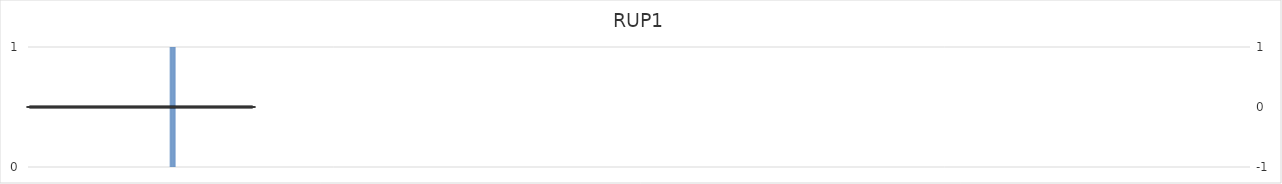
| Category | RUP1 |
|---|---|
| 1.0 | 0 |
| 2.0 | 0 |
| 3.0 | 0 |
| 4.0 | 0 |
| 5.0 | 0 |
| 6.0 | 0 |
| 7.0 | 0 |
| 8.0 | 0 |
| 9.0 | 0 |
| 10.0 | 0 |
| 11.0 | 0 |
| 12.0 | 0 |
| 13.0 | 0 |
| 14.0 | 0 |
| 15.0 | 0 |
| 16.0 | 0 |
| 17.0 | 0 |
| 18.0 | 0 |
| 19.0 | 0 |
| 20.0 | 0 |
| 21.0 | 0 |
| 22.0 | 0 |
| 23.0 | 0 |
| 24.0 | 0 |
| 25.0 | 0 |
| 26.0 | 0 |
| 27.0 | 0 |
| 28.0 | 0 |
| 29.0 | 0 |
| 30.0 | 0 |
| 31.0 | 0 |
| 32.0 | 0 |
| 33.0 | 0 |
| 34.0 | 0 |
| 35.0 | 0 |
| 36.0 | 0 |
| 37.0 | 0 |
| 38.0 | 0 |
| 39.0 | 0 |
| 40.0 | 0 |
| 41.0 | 0 |
| 42.0 | 0 |
| 43.0 | 0 |
| 44.0 | 0 |
| 45.0 | 0 |
| 46.0 | 0 |
| 47.0 | 0 |
| 48.0 | 0 |
| 49.0 | 0 |
| 50.0 | 0 |
| 51.0 | 0 |
| 52.0 | 0 |
| 53.0 | 0 |
| 54.0 | 0 |
| 55.0 | 0 |
| 56.0 | 0 |
| 57.0 | 0 |
| 58.0 | 0 |
| 59.0 | 0 |
| 60.0 | 0 |
| 61.0 | 0 |
| 62.0 | 0 |
| 63.0 | 0 |
| 64.0 | 0 |
| 65.0 | 0 |
| 66.0 | 0 |
| 67.0 | 0 |
| 68.0 | 0 |
| 69.0 | 0 |
| 70.0 | 0 |
| 71.0 | 0 |
| 72.0 | 0 |
| 73.0 | 0 |
| 74.0 | 0 |
| 75.0 | 0 |
| 76.0 | 0 |
| 77.0 | 0 |
| 78.0 | 0 |
| 79.0 | 0 |
| 80.0 | 0 |
| 81.0 | 0 |
| 82.0 | 0 |
| 83.0 | 0 |
| 84.0 | 0 |
| 85.0 | 0 |
| 86.0 | 0 |
| 87.0 | 0 |
| 88.0 | 0 |
| 89.0 | 0 |
| 90.0 | 0 |
| 91.0 | 0 |
| 92.0 | 0 |
| 93.0 | 0 |
| 94.0 | 0 |
| 95.0 | 0 |
| 96.0 | 0 |
| 97.0 | 0 |
| 98.0 | 0 |
| 99.0 | 0 |
| 100.0 | 0 |
| 101.0 | 0 |
| 102.0 | 0 |
| 103.0 | 0 |
| 104.0 | 0 |
| 105.0 | 0 |
| 106.0 | 0 |
| 107.0 | 0 |
| 108.0 | 0 |
| 109.0 | 0 |
| 110.0 | 0 |
| 111.0 | 0 |
| 112.0 | 0 |
| 113.0 | 0 |
| 114.0 | 0 |
| 115.0 | 0 |
| 116.0 | 0 |
| 117.0 | 0 |
| 118.0 | 0 |
| 119.0 | 0 |
| 120.0 | 0 |
| 121.0 | 0 |
| 122.0 | 0 |
| 123.0 | 0 |
| 124.0 | 0 |
| 125.0 | 0 |
| 126.0 | 0 |
| 127.0 | 0 |
| 128.0 | 0 |
| 129.0 | 0 |
| 130.0 | 0 |
| 131.0 | 0 |
| 132.0 | 0 |
| 133.0 | 0 |
| 134.0 | 0 |
| 135.0 | 0 |
| 136.0 | 0 |
| 137.0 | 0 |
| 138.0 | 0 |
| 139.0 | 0 |
| 140.0 | 0 |
| 141.0 | 0 |
| 142.0 | 0 |
| 143.0 | 0 |
| 144.0 | 0 |
| 145.0 | 0 |
| 146.0 | 0 |
| 147.0 | 0 |
| 148.0 | 0 |
| 149.0 | 0 |
| 150.0 | 0 |
| 151.0 | 0 |
| 152.0 | 0 |
| 153.0 | 0 |
| 154.0 | 0 |
| 155.0 | 0 |
| 156.0 | 0 |
| 157.0 | 0 |
| 158.0 | 0 |
| 159.0 | 0 |
| 160.0 | 0 |
| 161.0 | 0 |
| 162.0 | 0 |
| 163.0 | 0 |
| 164.0 | 0 |
| 165.0 | 0 |
| 166.0 | 0 |
| 167.0 | 0 |
| 168.0 | 0 |
| 169.0 | 0 |
| 170.0 | 0 |
| 171.0 | 0 |
| 172.0 | 0 |
| 173.0 | 0 |
| 174.0 | 0 |
| 175.0 | 0 |
| 176.0 | 0 |
| 177.0 | 0 |
| 178.0 | 0 |
| 179.0 | 0 |
| 180.0 | 0 |
| 181.0 | 0 |
| 182.0 | 0 |
| 183.0 | 0 |
| 184.0 | 0 |
| 185.0 | 0 |
| 186.0 | 0 |
| 187.0 | 0 |
| 188.0 | 0 |
| 189.0 | 0 |
| 190.0 | 0 |
| 191.0 | 0 |
| 192.0 | 0 |
| 193.0 | 0 |
| 194.0 | 0 |
| 195.0 | 0 |
| 196.0 | 0 |
| 197.0 | 0 |
| 198.0 | 0 |
| 199.0 | 1 |
| 200.0 | 1 |
| 201.0 | 1 |
| 202.0 | 1 |
| 203.0 | 1 |
| 204.0 | 1 |
| 205.0 | 1 |
| 206.0 | 1 |
| 207.0 | 0 |
| 208.0 | 0 |
| 209.0 | 0 |
| 210.0 | 0 |
| 211.0 | 0 |
| 212.0 | 0 |
| 213.0 | 0 |
| 214.0 | 0 |
| 215.0 | 0 |
| 216.0 | 0 |
| 217.0 | 0 |
| 218.0 | 0 |
| 219.0 | 0 |
| 220.0 | 0 |
| 221.0 | 0 |
| 222.0 | 0 |
| 223.0 | 0 |
| 224.0 | 0 |
| 225.0 | 0 |
| 226.0 | 0 |
| 227.0 | 0 |
| 228.0 | 0 |
| 229.0 | 0 |
| 230.0 | 0 |
| 231.0 | 0 |
| 232.0 | 0 |
| 233.0 | 0 |
| 234.0 | 0 |
| 235.0 | 0 |
| 236.0 | 0 |
| 237.0 | 0 |
| 238.0 | 0 |
| 239.0 | 0 |
| 240.0 | 0 |
| 241.0 | 0 |
| 242.0 | 0 |
| 243.0 | 0 |
| 244.0 | 0 |
| 245.0 | 0 |
| 246.0 | 0 |
| 247.0 | 0 |
| 248.0 | 0 |
| 249.0 | 0 |
| 250.0 | 0 |
| 251.0 | 0 |
| 252.0 | 0 |
| 253.0 | 0 |
| 254.0 | 0 |
| 255.0 | 0 |
| 256.0 | 0 |
| 257.0 | 0 |
| 258.0 | 0 |
| 259.0 | 0 |
| 260.0 | 0 |
| 261.0 | 0 |
| 262.0 | 0 |
| 263.0 | 0 |
| 264.0 | 0 |
| 265.0 | 0 |
| 266.0 | 0 |
| 267.0 | 0 |
| 268.0 | 0 |
| 269.0 | 0 |
| 270.0 | 0 |
| 271.0 | 0 |
| 272.0 | 0 |
| 273.0 | 0 |
| 274.0 | 0 |
| 275.0 | 0 |
| 276.0 | 0 |
| 277.0 | 0 |
| 278.0 | 0 |
| 279.0 | 0 |
| 280.0 | 0 |
| 281.0 | 0 |
| 282.0 | 0 |
| 283.0 | 0 |
| 284.0 | 0 |
| 285.0 | 0 |
| 286.0 | 0 |
| 287.0 | 0 |
| 288.0 | 0 |
| 289.0 | 0 |
| 290.0 | 0 |
| 291.0 | 0 |
| 292.0 | 0 |
| 293.0 | 0 |
| 294.0 | 0 |
| 295.0 | 0 |
| 296.0 | 0 |
| 297.0 | 0 |
| 298.0 | 0 |
| 299.0 | 0 |
| 300.0 | 0 |
| 301.0 | 0 |
| 302.0 | 0 |
| 303.0 | 0 |
| 304.0 | 0 |
| 305.0 | 0 |
| 306.0 | 0 |
| 307.0 | 0 |
| 308.0 | 0 |
| 309.0 | 0 |
| 310.0 | 0 |
| 311.0 | 0 |
| 312.0 | 0 |
| 313.0 | 0 |
| 314.0 | 0 |
| 315.0 | 0 |
| 316.0 | 0 |
| 317.0 | 0 |
| 318.0 | 0 |
| 319.0 | 0 |
| 320.0 | 0 |
| 321.0 | 0 |
| 322.0 | 0 |
| 323.0 | 0 |
| 324.0 | 0 |
| 325.0 | 0 |
| 326.0 | 0 |
| 327.0 | 0 |
| 328.0 | 0 |
| 329.0 | 0 |
| 330.0 | 0 |
| 331.0 | 0 |
| 332.0 | 0 |
| 333.0 | 0 |
| 334.0 | 0 |
| 335.0 | 0 |
| 336.0 | 0 |
| 337.0 | 0 |
| 338.0 | 0 |
| 339.0 | 0 |
| 340.0 | 0 |
| 341.0 | 0 |
| 342.0 | 0 |
| 343.0 | 0 |
| 344.0 | 0 |
| 345.0 | 0 |
| 346.0 | 0 |
| 347.0 | 0 |
| 348.0 | 0 |
| 349.0 | 0 |
| 350.0 | 0 |
| 351.0 | 0 |
| 352.0 | 0 |
| 353.0 | 0 |
| 354.0 | 0 |
| 355.0 | 0 |
| 356.0 | 0 |
| 357.0 | 0 |
| 358.0 | 0 |
| 359.0 | 0 |
| 360.0 | 0 |
| 361.0 | 0 |
| 362.0 | 0 |
| 363.0 | 0 |
| 364.0 | 0 |
| 365.0 | 0 |
| 366.0 | 0 |
| 367.0 | 0 |
| 368.0 | 0 |
| 369.0 | 0 |
| 370.0 | 0 |
| 371.0 | 0 |
| 372.0 | 0 |
| 373.0 | 0 |
| 374.0 | 0 |
| 375.0 | 0 |
| 376.0 | 0 |
| 377.0 | 0 |
| 378.0 | 0 |
| 379.0 | 0 |
| 380.0 | 0 |
| 381.0 | 0 |
| 382.0 | 0 |
| 383.0 | 0 |
| 384.0 | 0 |
| 385.0 | 0 |
| 386.0 | 0 |
| 387.0 | 0 |
| 388.0 | 0 |
| 389.0 | 0 |
| 390.0 | 0 |
| 391.0 | 0 |
| 392.0 | 0 |
| 393.0 | 0 |
| 394.0 | 0 |
| 395.0 | 0 |
| 396.0 | 0 |
| 397.0 | 0 |
| 398.0 | 0 |
| 399.0 | 0 |
| 400.0 | 0 |
| 401.0 | 0 |
| 402.0 | 0 |
| 403.0 | 0 |
| 404.0 | 0 |
| 405.0 | 0 |
| 406.0 | 0 |
| 407.0 | 0 |
| 408.0 | 0 |
| 409.0 | 0 |
| 410.0 | 0 |
| 411.0 | 0 |
| 412.0 | 0 |
| 413.0 | 0 |
| 414.0 | 0 |
| 415.0 | 0 |
| 416.0 | 0 |
| 417.0 | 0 |
| 418.0 | 0 |
| 419.0 | 0 |
| 420.0 | 0 |
| 421.0 | 0 |
| 422.0 | 0 |
| 423.0 | 0 |
| 424.0 | 0 |
| 425.0 | 0 |
| 426.0 | 0 |
| 427.0 | 0 |
| 428.0 | 0 |
| 429.0 | 0 |
| 430.0 | 0 |
| 431.0 | 0 |
| 432.0 | 0 |
| 433.0 | 0 |
| 434.0 | 0 |
| 435.0 | 0 |
| 436.0 | 0 |
| 437.0 | 0 |
| 438.0 | 0 |
| 439.0 | 0 |
| 440.0 | 0 |
| 441.0 | 0 |
| 442.0 | 0 |
| 443.0 | 0 |
| 444.0 | 0 |
| 445.0 | 0 |
| 446.0 | 0 |
| 447.0 | 0 |
| 448.0 | 0 |
| 449.0 | 0 |
| 450.0 | 0 |
| 451.0 | 0 |
| 452.0 | 0 |
| 453.0 | 0 |
| 454.0 | 0 |
| 455.0 | 0 |
| 456.0 | 0 |
| 457.0 | 0 |
| 458.0 | 0 |
| 459.0 | 0 |
| 460.0 | 0 |
| 461.0 | 0 |
| 462.0 | 0 |
| 463.0 | 0 |
| 464.0 | 0 |
| 465.0 | 0 |
| 466.0 | 0 |
| 467.0 | 0 |
| 468.0 | 0 |
| 469.0 | 0 |
| 470.0 | 0 |
| 471.0 | 0 |
| 472.0 | 0 |
| 473.0 | 0 |
| 474.0 | 0 |
| 475.0 | 0 |
| 476.0 | 0 |
| 477.0 | 0 |
| 478.0 | 0 |
| 479.0 | 0 |
| 480.0 | 0 |
| 481.0 | 0 |
| 482.0 | 0 |
| 483.0 | 0 |
| 484.0 | 0 |
| 485.0 | 0 |
| 486.0 | 0 |
| 487.0 | 0 |
| 488.0 | 0 |
| 489.0 | 0 |
| 490.0 | 0 |
| 491.0 | 0 |
| 492.0 | 0 |
| 493.0 | 0 |
| 494.0 | 0 |
| 495.0 | 0 |
| 496.0 | 0 |
| 497.0 | 0 |
| 498.0 | 0 |
| 499.0 | 0 |
| 500.0 | 0 |
| 501.0 | 0 |
| 502.0 | 0 |
| 503.0 | 0 |
| 504.0 | 0 |
| 505.0 | 0 |
| 506.0 | 0 |
| 507.0 | 0 |
| 508.0 | 0 |
| 509.0 | 0 |
| 510.0 | 0 |
| 511.0 | 0 |
| 512.0 | 0 |
| 513.0 | 0 |
| 514.0 | 0 |
| 515.0 | 0 |
| 516.0 | 0 |
| 517.0 | 0 |
| 518.0 | 0 |
| 519.0 | 0 |
| 520.0 | 0 |
| 521.0 | 0 |
| 522.0 | 0 |
| 523.0 | 0 |
| 524.0 | 0 |
| 525.0 | 0 |
| 526.0 | 0 |
| 527.0 | 0 |
| 528.0 | 0 |
| 529.0 | 0 |
| 530.0 | 0 |
| 531.0 | 0 |
| 532.0 | 0 |
| 533.0 | 0 |
| 534.0 | 0 |
| 535.0 | 0 |
| 536.0 | 0 |
| 537.0 | 0 |
| 538.0 | 0 |
| 539.0 | 0 |
| 540.0 | 0 |
| 541.0 | 0 |
| 542.0 | 0 |
| 543.0 | 0 |
| 544.0 | 0 |
| 545.0 | 0 |
| 546.0 | 0 |
| 547.0 | 0 |
| 548.0 | 0 |
| 549.0 | 0 |
| 550.0 | 0 |
| 551.0 | 0 |
| 552.0 | 0 |
| 553.0 | 0 |
| 554.0 | 0 |
| 555.0 | 0 |
| 556.0 | 0 |
| 557.0 | 0 |
| 558.0 | 0 |
| 559.0 | 0 |
| 560.0 | 0 |
| 561.0 | 0 |
| 562.0 | 0 |
| 563.0 | 0 |
| 564.0 | 0 |
| 565.0 | 0 |
| 566.0 | 0 |
| 567.0 | 0 |
| 568.0 | 0 |
| 569.0 | 0 |
| 570.0 | 0 |
| 571.0 | 0 |
| 572.0 | 0 |
| 573.0 | 0 |
| 574.0 | 0 |
| 575.0 | 0 |
| 576.0 | 0 |
| 577.0 | 0 |
| 578.0 | 0 |
| 579.0 | 0 |
| 580.0 | 0 |
| 581.0 | 0 |
| 582.0 | 0 |
| 583.0 | 0 |
| 584.0 | 0 |
| 585.0 | 0 |
| 586.0 | 0 |
| 587.0 | 0 |
| 588.0 | 0 |
| 589.0 | 0 |
| 590.0 | 0 |
| 591.0 | 0 |
| 592.0 | 0 |
| 593.0 | 0 |
| 594.0 | 0 |
| 595.0 | 0 |
| 596.0 | 0 |
| 597.0 | 0 |
| 598.0 | 0 |
| 599.0 | 0 |
| 600.0 | 0 |
| 601.0 | 0 |
| 602.0 | 0 |
| 603.0 | 0 |
| 604.0 | 0 |
| 605.0 | 0 |
| 606.0 | 0 |
| 607.0 | 0 |
| 608.0 | 0 |
| 609.0 | 0 |
| 610.0 | 0 |
| 611.0 | 0 |
| 612.0 | 0 |
| 613.0 | 0 |
| 614.0 | 0 |
| 615.0 | 0 |
| 616.0 | 0 |
| 617.0 | 0 |
| 618.0 | 0 |
| 619.0 | 0 |
| 620.0 | 0 |
| 621.0 | 0 |
| 622.0 | 0 |
| 623.0 | 0 |
| 624.0 | 0 |
| 625.0 | 0 |
| 626.0 | 0 |
| 627.0 | 0 |
| 628.0 | 0 |
| 629.0 | 0 |
| 630.0 | 0 |
| 631.0 | 0 |
| 632.0 | 0 |
| 633.0 | 0 |
| 634.0 | 0 |
| 635.0 | 0 |
| 636.0 | 0 |
| 637.0 | 0 |
| 638.0 | 0 |
| 639.0 | 0 |
| 640.0 | 0 |
| 641.0 | 0 |
| 642.0 | 0 |
| 643.0 | 0 |
| 644.0 | 0 |
| 645.0 | 0 |
| 646.0 | 0 |
| 647.0 | 0 |
| 648.0 | 0 |
| 649.0 | 0 |
| 650.0 | 0 |
| 651.0 | 0 |
| 652.0 | 0 |
| 653.0 | 0 |
| 654.0 | 0 |
| 655.0 | 0 |
| 656.0 | 0 |
| 657.0 | 0 |
| 658.0 | 0 |
| 659.0 | 0 |
| 660.0 | 0 |
| 661.0 | 0 |
| 662.0 | 0 |
| 663.0 | 0 |
| 664.0 | 0 |
| 665.0 | 0 |
| 666.0 | 0 |
| 667.0 | 0 |
| 668.0 | 0 |
| 669.0 | 0 |
| 670.0 | 0 |
| 671.0 | 0 |
| 672.0 | 0 |
| 673.0 | 0 |
| 674.0 | 0 |
| 675.0 | 0 |
| 676.0 | 0 |
| 677.0 | 0 |
| 678.0 | 0 |
| 679.0 | 0 |
| 680.0 | 0 |
| 681.0 | 0 |
| 682.0 | 0 |
| 683.0 | 0 |
| 684.0 | 0 |
| 685.0 | 0 |
| 686.0 | 0 |
| 687.0 | 0 |
| 688.0 | 0 |
| 689.0 | 0 |
| 690.0 | 0 |
| 691.0 | 0 |
| 692.0 | 0 |
| 693.0 | 0 |
| 694.0 | 0 |
| 695.0 | 0 |
| 696.0 | 0 |
| 697.0 | 0 |
| 698.0 | 0 |
| 699.0 | 0 |
| 700.0 | 0 |
| 701.0 | 0 |
| 702.0 | 0 |
| 703.0 | 0 |
| 704.0 | 0 |
| 705.0 | 0 |
| 706.0 | 0 |
| 707.0 | 0 |
| 708.0 | 0 |
| 709.0 | 0 |
| 710.0 | 0 |
| 711.0 | 0 |
| 712.0 | 0 |
| 713.0 | 0 |
| 714.0 | 0 |
| 715.0 | 0 |
| 716.0 | 0 |
| 717.0 | 0 |
| 718.0 | 0 |
| 719.0 | 0 |
| 720.0 | 0 |
| 721.0 | 0 |
| 722.0 | 0 |
| 723.0 | 0 |
| 724.0 | 0 |
| 725.0 | 0 |
| 726.0 | 0 |
| 727.0 | 0 |
| 728.0 | 0 |
| 729.0 | 0 |
| 730.0 | 0 |
| 731.0 | 0 |
| 732.0 | 0 |
| 733.0 | 0 |
| 734.0 | 0 |
| 735.0 | 0 |
| 736.0 | 0 |
| 737.0 | 0 |
| 738.0 | 0 |
| 739.0 | 0 |
| 740.0 | 0 |
| 741.0 | 0 |
| 742.0 | 0 |
| 743.0 | 0 |
| 744.0 | 0 |
| 745.0 | 0 |
| 746.0 | 0 |
| 747.0 | 0 |
| 748.0 | 0 |
| 749.0 | 0 |
| 750.0 | 0 |
| 751.0 | 0 |
| 752.0 | 0 |
| 753.0 | 0 |
| 754.0 | 0 |
| 755.0 | 0 |
| 756.0 | 0 |
| 757.0 | 0 |
| 758.0 | 0 |
| 759.0 | 0 |
| 760.0 | 0 |
| 761.0 | 0 |
| 762.0 | 0 |
| 763.0 | 0 |
| 764.0 | 0 |
| 765.0 | 0 |
| 766.0 | 0 |
| 767.0 | 0 |
| 768.0 | 0 |
| 769.0 | 0 |
| 770.0 | 0 |
| 771.0 | 0 |
| 772.0 | 0 |
| 773.0 | 0 |
| 774.0 | 0 |
| 775.0 | 0 |
| 776.0 | 0 |
| 777.0 | 0 |
| 778.0 | 0 |
| 779.0 | 0 |
| 780.0 | 0 |
| 781.0 | 0 |
| 782.0 | 0 |
| 783.0 | 0 |
| 784.0 | 0 |
| 785.0 | 0 |
| 786.0 | 0 |
| 787.0 | 0 |
| 788.0 | 0 |
| 789.0 | 0 |
| 790.0 | 0 |
| 791.0 | 0 |
| 792.0 | 0 |
| 793.0 | 0 |
| 794.0 | 0 |
| 795.0 | 0 |
| 796.0 | 0 |
| 797.0 | 0 |
| 798.0 | 0 |
| 799.0 | 0 |
| 800.0 | 0 |
| 801.0 | 0 |
| 802.0 | 0 |
| 803.0 | 0 |
| 804.0 | 0 |
| 805.0 | 0 |
| 806.0 | 0 |
| 807.0 | 0 |
| 808.0 | 0 |
| 809.0 | 0 |
| 810.0 | 0 |
| 811.0 | 0 |
| 812.0 | 0 |
| 813.0 | 0 |
| 814.0 | 0 |
| 815.0 | 0 |
| 816.0 | 0 |
| 817.0 | 0 |
| 818.0 | 0 |
| 819.0 | 0 |
| 820.0 | 0 |
| 821.0 | 0 |
| 822.0 | 0 |
| 823.0 | 0 |
| 824.0 | 0 |
| 825.0 | 0 |
| 826.0 | 0 |
| 827.0 | 0 |
| 828.0 | 0 |
| 829.0 | 0 |
| 830.0 | 0 |
| 831.0 | 0 |
| 832.0 | 0 |
| 833.0 | 0 |
| 834.0 | 0 |
| 835.0 | 0 |
| 836.0 | 0 |
| 837.0 | 0 |
| 838.0 | 0 |
| 839.0 | 0 |
| 840.0 | 0 |
| 841.0 | 0 |
| 842.0 | 0 |
| 843.0 | 0 |
| 844.0 | 0 |
| 845.0 | 0 |
| 846.0 | 0 |
| 847.0 | 0 |
| 848.0 | 0 |
| 849.0 | 0 |
| 850.0 | 0 |
| 851.0 | 0 |
| 852.0 | 0 |
| 853.0 | 0 |
| 854.0 | 0 |
| 855.0 | 0 |
| 856.0 | 0 |
| 857.0 | 0 |
| 858.0 | 0 |
| 859.0 | 0 |
| 860.0 | 0 |
| 861.0 | 0 |
| 862.0 | 0 |
| 863.0 | 0 |
| 864.0 | 0 |
| 865.0 | 0 |
| 866.0 | 0 |
| 867.0 | 0 |
| 868.0 | 0 |
| 869.0 | 0 |
| 870.0 | 0 |
| 871.0 | 0 |
| 872.0 | 0 |
| 873.0 | 0 |
| 874.0 | 0 |
| 875.0 | 0 |
| 876.0 | 0 |
| 877.0 | 0 |
| 878.0 | 0 |
| 879.0 | 0 |
| 880.0 | 0 |
| 881.0 | 0 |
| 882.0 | 0 |
| 883.0 | 0 |
| 884.0 | 0 |
| 885.0 | 0 |
| 886.0 | 0 |
| 887.0 | 0 |
| 888.0 | 0 |
| 889.0 | 0 |
| 890.0 | 0 |
| 891.0 | 0 |
| 892.0 | 0 |
| 893.0 | 0 |
| 894.0 | 0 |
| 895.0 | 0 |
| 896.0 | 0 |
| 897.0 | 0 |
| 898.0 | 0 |
| 899.0 | 0 |
| 900.0 | 0 |
| 901.0 | 0 |
| 902.0 | 0 |
| 903.0 | 0 |
| 904.0 | 0 |
| 905.0 | 0 |
| 906.0 | 0 |
| 907.0 | 0 |
| 908.0 | 0 |
| 909.0 | 0 |
| 910.0 | 0 |
| 911.0 | 0 |
| 912.0 | 0 |
| 913.0 | 0 |
| 914.0 | 0 |
| 915.0 | 0 |
| 916.0 | 0 |
| 917.0 | 0 |
| 918.0 | 0 |
| 919.0 | 0 |
| 920.0 | 0 |
| 921.0 | 0 |
| 922.0 | 0 |
| 923.0 | 0 |
| 924.0 | 0 |
| 925.0 | 0 |
| 926.0 | 0 |
| 927.0 | 0 |
| 928.0 | 0 |
| 929.0 | 0 |
| 930.0 | 0 |
| 931.0 | 0 |
| 932.0 | 0 |
| 933.0 | 0 |
| 934.0 | 0 |
| 935.0 | 0 |
| 936.0 | 0 |
| 937.0 | 0 |
| 938.0 | 0 |
| 939.0 | 0 |
| 940.0 | 0 |
| 941.0 | 0 |
| 942.0 | 0 |
| 943.0 | 0 |
| 944.0 | 0 |
| 945.0 | 0 |
| 946.0 | 0 |
| 947.0 | 0 |
| 948.0 | 0 |
| 949.0 | 0 |
| 950.0 | 0 |
| 951.0 | 0 |
| 952.0 | 0 |
| 953.0 | 0 |
| 954.0 | 0 |
| 955.0 | 0 |
| 956.0 | 0 |
| 957.0 | 0 |
| 958.0 | 0 |
| 959.0 | 0 |
| 960.0 | 0 |
| 961.0 | 0 |
| 962.0 | 0 |
| 963.0 | 0 |
| 964.0 | 0 |
| 965.0 | 0 |
| 966.0 | 0 |
| 967.0 | 0 |
| 968.0 | 0 |
| 969.0 | 0 |
| 970.0 | 0 |
| 971.0 | 0 |
| 972.0 | 0 |
| 973.0 | 0 |
| 974.0 | 0 |
| 975.0 | 0 |
| 976.0 | 0 |
| 977.0 | 0 |
| 978.0 | 0 |
| 979.0 | 0 |
| 980.0 | 0 |
| 981.0 | 0 |
| 982.0 | 0 |
| 983.0 | 0 |
| 984.0 | 0 |
| 985.0 | 0 |
| 986.0 | 0 |
| 987.0 | 0 |
| 988.0 | 0 |
| 989.0 | 0 |
| 990.0 | 0 |
| 991.0 | 0 |
| 992.0 | 0 |
| 993.0 | 0 |
| 994.0 | 0 |
| 995.0 | 0 |
| 996.0 | 0 |
| 997.0 | 0 |
| 998.0 | 0 |
| 999.0 | 0 |
| 1000.0 | 0 |
| 1001.0 | 0 |
| 1002.0 | 0 |
| 1003.0 | 0 |
| 1004.0 | 0 |
| 1005.0 | 0 |
| 1006.0 | 0 |
| 1007.0 | 0 |
| 1008.0 | 0 |
| 1009.0 | 0 |
| 1010.0 | 0 |
| 1011.0 | 0 |
| 1012.0 | 0 |
| 1013.0 | 0 |
| 1014.0 | 0 |
| 1015.0 | 0 |
| 1016.0 | 0 |
| 1017.0 | 0 |
| 1018.0 | 0 |
| 1019.0 | 0 |
| 1020.0 | 0 |
| 1021.0 | 0 |
| 1022.0 | 0 |
| 1023.0 | 0 |
| 1024.0 | 0 |
| 1025.0 | 0 |
| 1026.0 | 0 |
| 1027.0 | 0 |
| 1028.0 | 0 |
| 1029.0 | 0 |
| 1030.0 | 0 |
| 1031.0 | 0 |
| 1032.0 | 0 |
| 1033.0 | 0 |
| 1034.0 | 0 |
| 1035.0 | 0 |
| 1036.0 | 0 |
| 1037.0 | 0 |
| 1038.0 | 0 |
| 1039.0 | 0 |
| 1040.0 | 0 |
| 1041.0 | 0 |
| 1042.0 | 0 |
| 1043.0 | 0 |
| 1044.0 | 0 |
| 1045.0 | 0 |
| 1046.0 | 0 |
| 1047.0 | 0 |
| 1048.0 | 0 |
| 1049.0 | 0 |
| 1050.0 | 0 |
| 1051.0 | 0 |
| 1052.0 | 0 |
| 1053.0 | 0 |
| 1054.0 | 0 |
| 1055.0 | 0 |
| 1056.0 | 0 |
| 1057.0 | 0 |
| 1058.0 | 0 |
| 1059.0 | 0 |
| 1060.0 | 0 |
| 1061.0 | 0 |
| 1062.0 | 0 |
| 1063.0 | 0 |
| 1064.0 | 0 |
| 1065.0 | 0 |
| 1066.0 | 0 |
| 1067.0 | 0 |
| 1068.0 | 0 |
| 1069.0 | 0 |
| 1070.0 | 0 |
| 1071.0 | 0 |
| 1072.0 | 0 |
| 1073.0 | 0 |
| 1074.0 | 0 |
| 1075.0 | 0 |
| 1076.0 | 0 |
| 1077.0 | 0 |
| 1078.0 | 0 |
| 1079.0 | 0 |
| 1080.0 | 0 |
| 1081.0 | 0 |
| 1082.0 | 0 |
| 1083.0 | 0 |
| 1084.0 | 0 |
| 1085.0 | 0 |
| 1086.0 | 0 |
| 1087.0 | 0 |
| 1088.0 | 0 |
| 1089.0 | 0 |
| 1090.0 | 0 |
| 1091.0 | 0 |
| 1092.0 | 0 |
| 1093.0 | 0 |
| 1094.0 | 0 |
| 1095.0 | 0 |
| 1096.0 | 0 |
| 1097.0 | 0 |
| 1098.0 | 0 |
| 1099.0 | 0 |
| 1100.0 | 0 |
| 1101.0 | 0 |
| 1102.0 | 0 |
| 1103.0 | 0 |
| 1104.0 | 0 |
| 1105.0 | 0 |
| 1106.0 | 0 |
| 1107.0 | 0 |
| 1108.0 | 0 |
| 1109.0 | 0 |
| 1110.0 | 0 |
| 1111.0 | 0 |
| 1112.0 | 0 |
| 1113.0 | 0 |
| 1114.0 | 0 |
| 1115.0 | 0 |
| 1116.0 | 0 |
| 1117.0 | 0 |
| 1118.0 | 0 |
| 1119.0 | 0 |
| 1120.0 | 0 |
| 1121.0 | 0 |
| 1122.0 | 0 |
| 1123.0 | 0 |
| 1124.0 | 0 |
| 1125.0 | 0 |
| 1126.0 | 0 |
| 1127.0 | 0 |
| 1128.0 | 0 |
| 1129.0 | 0 |
| 1130.0 | 0 |
| 1131.0 | 0 |
| 1132.0 | 0 |
| 1133.0 | 0 |
| 1134.0 | 0 |
| 1135.0 | 0 |
| 1136.0 | 0 |
| 1137.0 | 0 |
| 1138.0 | 0 |
| 1139.0 | 0 |
| 1140.0 | 0 |
| 1141.0 | 0 |
| 1142.0 | 0 |
| 1143.0 | 0 |
| 1144.0 | 0 |
| 1145.0 | 0 |
| 1146.0 | 0 |
| 1147.0 | 0 |
| 1148.0 | 0 |
| 1149.0 | 0 |
| 1150.0 | 0 |
| 1151.0 | 0 |
| 1152.0 | 0 |
| 1153.0 | 0 |
| 1154.0 | 0 |
| 1155.0 | 0 |
| 1156.0 | 0 |
| 1157.0 | 0 |
| 1158.0 | 0 |
| 1159.0 | 0 |
| 1160.0 | 0 |
| 1161.0 | 0 |
| 1162.0 | 0 |
| 1163.0 | 0 |
| 1164.0 | 0 |
| 1165.0 | 0 |
| 1166.0 | 0 |
| 1167.0 | 0 |
| 1168.0 | 0 |
| 1169.0 | 0 |
| 1170.0 | 0 |
| 1171.0 | 0 |
| 1172.0 | 0 |
| 1173.0 | 0 |
| 1174.0 | 0 |
| 1175.0 | 0 |
| 1176.0 | 0 |
| 1177.0 | 0 |
| 1178.0 | 0 |
| 1179.0 | 0 |
| 1180.0 | 0 |
| 1181.0 | 0 |
| 1182.0 | 0 |
| 1183.0 | 0 |
| 1184.0 | 0 |
| 1185.0 | 0 |
| 1186.0 | 0 |
| 1187.0 | 0 |
| 1188.0 | 0 |
| 1189.0 | 0 |
| 1190.0 | 0 |
| 1191.0 | 0 |
| 1192.0 | 0 |
| 1193.0 | 0 |
| 1194.0 | 0 |
| 1195.0 | 0 |
| 1196.0 | 0 |
| 1197.0 | 0 |
| 1198.0 | 0 |
| 1199.0 | 0 |
| 1200.0 | 0 |
| 1201.0 | 0 |
| 1202.0 | 0 |
| 1203.0 | 0 |
| 1204.0 | 0 |
| 1205.0 | 0 |
| 1206.0 | 0 |
| 1207.0 | 0 |
| 1208.0 | 0 |
| 1209.0 | 0 |
| 1210.0 | 0 |
| 1211.0 | 0 |
| 1212.0 | 0 |
| 1213.0 | 0 |
| 1214.0 | 0 |
| 1215.0 | 0 |
| 1216.0 | 0 |
| 1217.0 | 0 |
| 1218.0 | 0 |
| 1219.0 | 0 |
| 1220.0 | 0 |
| 1221.0 | 0 |
| 1222.0 | 0 |
| 1223.0 | 0 |
| 1224.0 | 0 |
| 1225.0 | 0 |
| 1226.0 | 0 |
| 1227.0 | 0 |
| 1228.0 | 0 |
| 1229.0 | 0 |
| 1230.0 | 0 |
| 1231.0 | 0 |
| 1232.0 | 0 |
| 1233.0 | 0 |
| 1234.0 | 0 |
| 1235.0 | 0 |
| 1236.0 | 0 |
| 1237.0 | 0 |
| 1238.0 | 0 |
| 1239.0 | 0 |
| 1240.0 | 0 |
| 1241.0 | 0 |
| 1242.0 | 0 |
| 1243.0 | 0 |
| 1244.0 | 0 |
| 1245.0 | 0 |
| 1246.0 | 0 |
| 1247.0 | 0 |
| 1248.0 | 0 |
| 1249.0 | 0 |
| 1250.0 | 0 |
| 1251.0 | 0 |
| 1252.0 | 0 |
| 1253.0 | 0 |
| 1254.0 | 0 |
| 1255.0 | 0 |
| 1256.0 | 0 |
| 1257.0 | 0 |
| 1258.0 | 0 |
| 1259.0 | 0 |
| 1260.0 | 0 |
| 1261.0 | 0 |
| 1262.0 | 0 |
| 1263.0 | 0 |
| 1264.0 | 0 |
| 1265.0 | 0 |
| 1266.0 | 0 |
| 1267.0 | 0 |
| 1268.0 | 0 |
| 1269.0 | 0 |
| 1270.0 | 0 |
| 1271.0 | 0 |
| 1272.0 | 0 |
| 1273.0 | 0 |
| 1274.0 | 0 |
| 1275.0 | 0 |
| 1276.0 | 0 |
| 1277.0 | 0 |
| 1278.0 | 0 |
| 1279.0 | 0 |
| 1280.0 | 0 |
| 1281.0 | 0 |
| 1282.0 | 0 |
| 1283.0 | 0 |
| 1284.0 | 0 |
| 1285.0 | 0 |
| 1286.0 | 0 |
| 1287.0 | 0 |
| 1288.0 | 0 |
| 1289.0 | 0 |
| 1290.0 | 0 |
| 1291.0 | 0 |
| 1292.0 | 0 |
| 1293.0 | 0 |
| 1294.0 | 0 |
| 1295.0 | 0 |
| 1296.0 | 0 |
| 1297.0 | 0 |
| 1298.0 | 0 |
| 1299.0 | 0 |
| 1300.0 | 0 |
| 1301.0 | 0 |
| 1302.0 | 0 |
| 1303.0 | 0 |
| 1304.0 | 0 |
| 1305.0 | 0 |
| 1306.0 | 0 |
| 1307.0 | 0 |
| 1308.0 | 0 |
| 1309.0 | 0 |
| 1310.0 | 0 |
| 1311.0 | 0 |
| 1312.0 | 0 |
| 1313.0 | 0 |
| 1314.0 | 0 |
| 1315.0 | 0 |
| 1316.0 | 0 |
| 1317.0 | 0 |
| 1318.0 | 0 |
| 1319.0 | 0 |
| 1320.0 | 0 |
| 1321.0 | 0 |
| 1322.0 | 0 |
| 1323.0 | 0 |
| 1324.0 | 0 |
| 1325.0 | 0 |
| 1326.0 | 0 |
| 1327.0 | 0 |
| 1328.0 | 0 |
| 1329.0 | 0 |
| 1330.0 | 0 |
| 1331.0 | 0 |
| 1332.0 | 0 |
| 1333.0 | 0 |
| 1334.0 | 0 |
| 1335.0 | 0 |
| 1336.0 | 0 |
| 1337.0 | 0 |
| 1338.0 | 0 |
| 1339.0 | 0 |
| 1340.0 | 0 |
| 1341.0 | 0 |
| 1342.0 | 0 |
| 1343.0 | 0 |
| 1344.0 | 0 |
| 1345.0 | 0 |
| 1346.0 | 0 |
| 1347.0 | 0 |
| 1348.0 | 0 |
| 1349.0 | 0 |
| 1350.0 | 0 |
| 1351.0 | 0 |
| 1352.0 | 0 |
| 1353.0 | 0 |
| 1354.0 | 0 |
| 1355.0 | 0 |
| 1356.0 | 0 |
| 1357.0 | 0 |
| 1358.0 | 0 |
| 1359.0 | 0 |
| 1360.0 | 0 |
| 1361.0 | 0 |
| 1362.0 | 0 |
| 1363.0 | 0 |
| 1364.0 | 0 |
| 1365.0 | 0 |
| 1366.0 | 0 |
| 1367.0 | 0 |
| 1368.0 | 0 |
| 1369.0 | 0 |
| 1370.0 | 0 |
| 1371.0 | 0 |
| 1372.0 | 0 |
| 1373.0 | 0 |
| 1374.0 | 0 |
| 1375.0 | 0 |
| 1376.0 | 0 |
| 1377.0 | 0 |
| 1378.0 | 0 |
| 1379.0 | 0 |
| 1380.0 | 0 |
| 1381.0 | 0 |
| 1382.0 | 0 |
| 1383.0 | 0 |
| 1384.0 | 0 |
| 1385.0 | 0 |
| 1386.0 | 0 |
| 1387.0 | 0 |
| 1388.0 | 0 |
| 1389.0 | 0 |
| 1390.0 | 0 |
| 1391.0 | 0 |
| 1392.0 | 0 |
| 1393.0 | 0 |
| 1394.0 | 0 |
| 1395.0 | 0 |
| 1396.0 | 0 |
| 1397.0 | 0 |
| 1398.0 | 0 |
| 1399.0 | 0 |
| 1400.0 | 0 |
| 1401.0 | 0 |
| 1402.0 | 0 |
| 1403.0 | 0 |
| 1404.0 | 0 |
| 1405.0 | 0 |
| 1406.0 | 0 |
| 1407.0 | 0 |
| 1408.0 | 0 |
| 1409.0 | 0 |
| 1410.0 | 0 |
| 1411.0 | 0 |
| 1412.0 | 0 |
| 1413.0 | 0 |
| 1414.0 | 0 |
| 1415.0 | 0 |
| 1416.0 | 0 |
| 1417.0 | 0 |
| 1418.0 | 0 |
| 1419.0 | 0 |
| 1420.0 | 0 |
| 1421.0 | 0 |
| 1422.0 | 0 |
| 1423.0 | 0 |
| 1424.0 | 0 |
| 1425.0 | 0 |
| 1426.0 | 0 |
| 1427.0 | 0 |
| 1428.0 | 0 |
| 1429.0 | 0 |
| 1430.0 | 0 |
| 1431.0 | 0 |
| 1432.0 | 0 |
| 1433.0 | 0 |
| 1434.0 | 0 |
| 1435.0 | 0 |
| 1436.0 | 0 |
| 1437.0 | 0 |
| 1438.0 | 0 |
| 1439.0 | 0 |
| 1440.0 | 0 |
| 1441.0 | 0 |
| 1442.0 | 0 |
| 1443.0 | 0 |
| 1444.0 | 0 |
| 1445.0 | 0 |
| 1446.0 | 0 |
| 1447.0 | 0 |
| 1448.0 | 0 |
| 1449.0 | 0 |
| 1450.0 | 0 |
| 1451.0 | 0 |
| 1452.0 | 0 |
| 1453.0 | 0 |
| 1454.0 | 0 |
| 1455.0 | 0 |
| 1456.0 | 0 |
| 1457.0 | 0 |
| 1458.0 | 0 |
| 1459.0 | 0 |
| 1460.0 | 0 |
| 1461.0 | 0 |
| 1462.0 | 0 |
| 1463.0 | 0 |
| 1464.0 | 0 |
| 1465.0 | 0 |
| 1466.0 | 0 |
| 1467.0 | 0 |
| 1468.0 | 0 |
| 1469.0 | 0 |
| 1470.0 | 0 |
| 1471.0 | 0 |
| 1472.0 | 0 |
| 1473.0 | 0 |
| 1474.0 | 0 |
| 1475.0 | 0 |
| 1476.0 | 0 |
| 1477.0 | 0 |
| 1478.0 | 0 |
| 1479.0 | 0 |
| 1480.0 | 0 |
| 1481.0 | 0 |
| 1482.0 | 0 |
| 1483.0 | 0 |
| 1484.0 | 0 |
| 1485.0 | 0 |
| 1486.0 | 0 |
| 1487.0 | 0 |
| 1488.0 | 0 |
| 1489.0 | 0 |
| 1490.0 | 0 |
| 1491.0 | 0 |
| 1492.0 | 0 |
| 1493.0 | 0 |
| 1494.0 | 0 |
| 1495.0 | 0 |
| 1496.0 | 0 |
| 1497.0 | 0 |
| 1498.0 | 0 |
| 1499.0 | 0 |
| 1500.0 | 0 |
| 1501.0 | 0 |
| 1502.0 | 0 |
| 1503.0 | 0 |
| 1504.0 | 0 |
| 1505.0 | 0 |
| 1506.0 | 0 |
| 1507.0 | 0 |
| 1508.0 | 0 |
| 1509.0 | 0 |
| 1510.0 | 0 |
| 1511.0 | 0 |
| 1512.0 | 0 |
| 1513.0 | 0 |
| 1514.0 | 0 |
| 1515.0 | 0 |
| 1516.0 | 0 |
| 1517.0 | 0 |
| 1518.0 | 0 |
| 1519.0 | 0 |
| 1520.0 | 0 |
| 1521.0 | 0 |
| 1522.0 | 0 |
| 1523.0 | 0 |
| 1524.0 | 0 |
| 1525.0 | 0 |
| 1526.0 | 0 |
| 1527.0 | 0 |
| 1528.0 | 0 |
| 1529.0 | 0 |
| 1530.0 | 0 |
| 1531.0 | 0 |
| 1532.0 | 0 |
| 1533.0 | 0 |
| 1534.0 | 0 |
| 1535.0 | 0 |
| 1536.0 | 0 |
| 1537.0 | 0 |
| 1538.0 | 0 |
| 1539.0 | 0 |
| 1540.0 | 0 |
| 1541.0 | 0 |
| 1542.0 | 0 |
| 1543.0 | 0 |
| 1544.0 | 0 |
| 1545.0 | 0 |
| 1546.0 | 0 |
| 1547.0 | 0 |
| 1548.0 | 0 |
| 1549.0 | 0 |
| 1550.0 | 0 |
| 1551.0 | 0 |
| 1552.0 | 0 |
| 1553.0 | 0 |
| 1554.0 | 0 |
| 1555.0 | 0 |
| 1556.0 | 0 |
| 1557.0 | 0 |
| 1558.0 | 0 |
| 1559.0 | 0 |
| 1560.0 | 0 |
| 1561.0 | 0 |
| 1562.0 | 0 |
| 1563.0 | 0 |
| 1564.0 | 0 |
| 1565.0 | 0 |
| 1566.0 | 0 |
| 1567.0 | 0 |
| 1568.0 | 0 |
| 1569.0 | 0 |
| 1570.0 | 0 |
| 1571.0 | 0 |
| 1572.0 | 0 |
| 1573.0 | 0 |
| 1574.0 | 0 |
| 1575.0 | 0 |
| 1576.0 | 0 |
| 1577.0 | 0 |
| 1578.0 | 0 |
| 1579.0 | 0 |
| 1580.0 | 0 |
| 1581.0 | 0 |
| 1582.0 | 0 |
| 1583.0 | 0 |
| 1584.0 | 0 |
| 1585.0 | 0 |
| 1586.0 | 0 |
| 1587.0 | 0 |
| 1588.0 | 0 |
| 1589.0 | 0 |
| 1590.0 | 0 |
| 1591.0 | 0 |
| 1592.0 | 0 |
| 1593.0 | 0 |
| 1594.0 | 0 |
| 1595.0 | 0 |
| 1596.0 | 0 |
| 1597.0 | 0 |
| 1598.0 | 0 |
| 1599.0 | 0 |
| 1600.0 | 0 |
| 1601.0 | 0 |
| 1602.0 | 0 |
| 1603.0 | 0 |
| 1604.0 | 0 |
| 1605.0 | 0 |
| 1606.0 | 0 |
| 1607.0 | 0 |
| 1608.0 | 0 |
| 1609.0 | 0 |
| 1610.0 | 0 |
| 1611.0 | 0 |
| 1612.0 | 0 |
| 1613.0 | 0 |
| 1614.0 | 0 |
| 1615.0 | 0 |
| 1616.0 | 0 |
| 1617.0 | 0 |
| 1618.0 | 0 |
| 1619.0 | 0 |
| 1620.0 | 0 |
| 1621.0 | 0 |
| 1622.0 | 0 |
| 1623.0 | 0 |
| 1624.0 | 0 |
| 1625.0 | 0 |
| 1626.0 | 0 |
| 1627.0 | 0 |
| 1628.0 | 0 |
| 1629.0 | 0 |
| 1630.0 | 0 |
| 1631.0 | 0 |
| 1632.0 | 0 |
| 1633.0 | 0 |
| 1634.0 | 0 |
| 1635.0 | 0 |
| 1636.0 | 0 |
| 1637.0 | 0 |
| 1638.0 | 0 |
| 1639.0 | 0 |
| 1640.0 | 0 |
| 1641.0 | 0 |
| 1642.0 | 0 |
| 1643.0 | 0 |
| 1644.0 | 0 |
| 1645.0 | 0 |
| 1646.0 | 0 |
| 1647.0 | 0 |
| 1648.0 | 0 |
| 1649.0 | 0 |
| 1650.0 | 0 |
| 1651.0 | 0 |
| 1652.0 | 0 |
| 1653.0 | 0 |
| 1654.0 | 0 |
| 1655.0 | 0 |
| 1656.0 | 0 |
| 1657.0 | 0 |
| 1658.0 | 0 |
| 1659.0 | 0 |
| 1660.0 | 0 |
| 1661.0 | 0 |
| 1662.0 | 0 |
| 1663.0 | 0 |
| 1664.0 | 0 |
| 1665.0 | 0 |
| 1666.0 | 0 |
| 1667.0 | 0 |
| 1668.0 | 0 |
| 1669.0 | 0 |
| 1670.0 | 0 |
| 1671.0 | 0 |
| 1672.0 | 0 |
| 1673.0 | 0 |
| 1674.0 | 0 |
| 1675.0 | 0 |
| 1676.0 | 0 |
| 1677.0 | 0 |
| 1678.0 | 0 |
| 1679.0 | 0 |
| 1680.0 | 0 |
| 1681.0 | 0 |
| 1682.0 | 0 |
| 1683.0 | 0 |
| 1684.0 | 0 |
| 1685.0 | 0 |
| 1686.0 | 0 |
| 1687.0 | 0 |
| 1688.0 | 0 |
| 1689.0 | 0 |
| 1690.0 | 0 |
| 1691.0 | 0 |
| 1692.0 | 0 |
| 1693.0 | 0 |
| 1694.0 | 0 |
| 1695.0 | 0 |
| 1696.0 | 0 |
| 1697.0 | 0 |
| 1698.0 | 0 |
| 1699.0 | 0 |
| 1700.0 | 0 |
| 1701.0 | 0 |
| 1702.0 | 0 |
| 1703.0 | 0 |
| 1704.0 | 0 |
| 1705.0 | 0 |
| 1706.0 | 0 |
| 1707.0 | 0 |